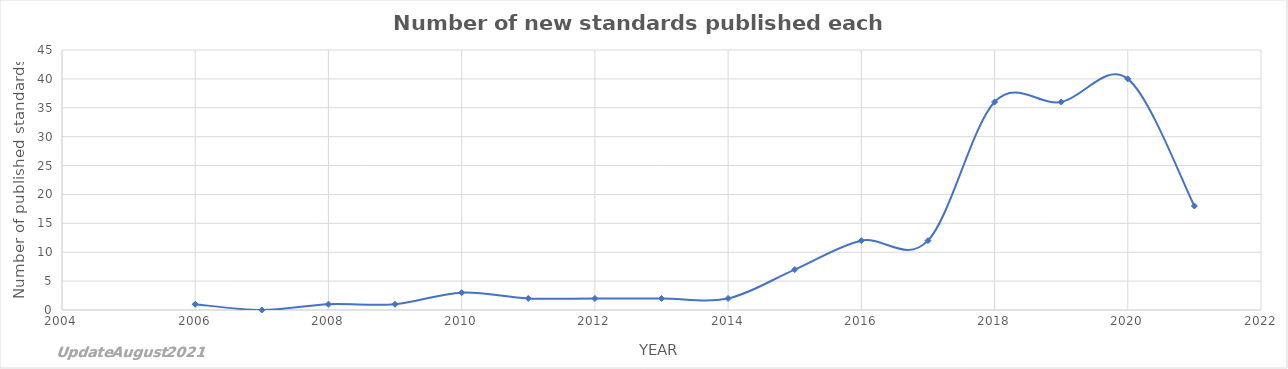
| Category | Series 0 |
|---|---|
| 2006.0 | 1 |
| 2007.0 | 0 |
| 2008.0 | 1 |
| 2009.0 | 1 |
| 2010.0 | 3 |
| 2011.0 | 2 |
| 2012.0 | 2 |
| 2013.0 | 2 |
| 2014.0 | 2 |
| 2015.0 | 7 |
| 2016.0 | 12 |
| 2017.0 | 12 |
| 2018.0 | 36 |
| 2019.0 | 36 |
| 2020.0 | 40 |
| 2021.0 | 18 |